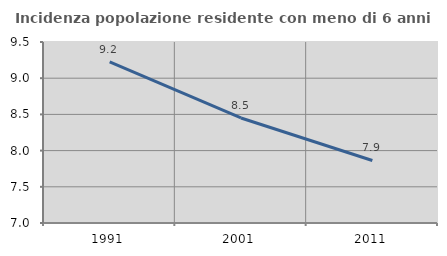
| Category | Incidenza popolazione residente con meno di 6 anni |
|---|---|
| 1991.0 | 9.227 |
| 2001.0 | 8.451 |
| 2011.0 | 7.864 |